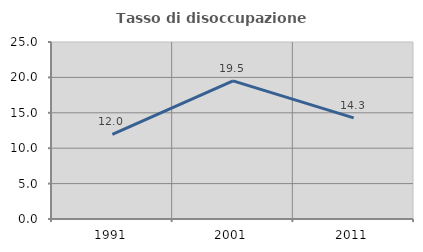
| Category | Tasso di disoccupazione giovanile  |
|---|---|
| 1991.0 | 11.957 |
| 2001.0 | 19.512 |
| 2011.0 | 14.286 |